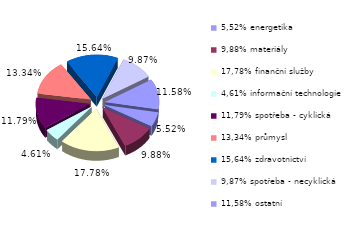
| Category | Series 0 |
|---|---|
| 5,52% energetika | 0.055 |
| 9,88% materiály | 0.099 |
| 17,78% finanční služby | 0.178 |
| 4,61% informační technologie | 0.046 |
| 11,79% spotřeba - cyklická | 0.118 |
| 13,34% průmysl | 0.133 |
| 15,64% zdravotnictví | 0.156 |
| 9,87% spotřeba - necyklická | 0.099 |
| 11,58% ostatní | 0.116 |